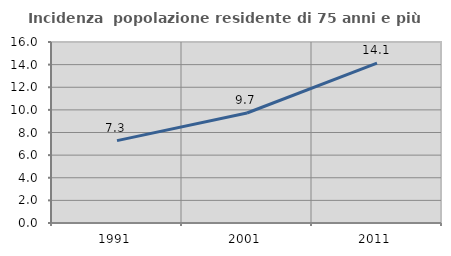
| Category | Incidenza  popolazione residente di 75 anni e più |
|---|---|
| 1991.0 | 7.283 |
| 2001.0 | 9.722 |
| 2011.0 | 14.137 |